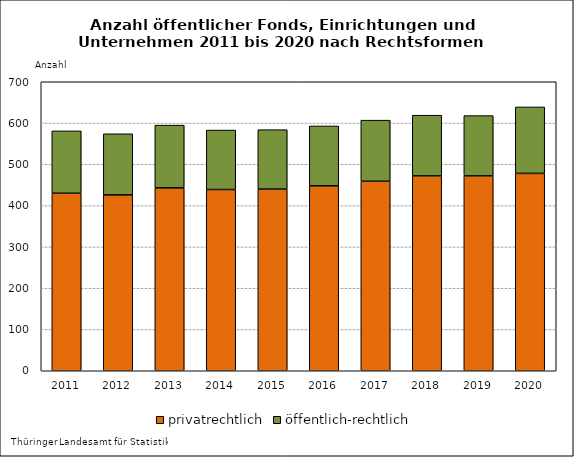
| Category | privatrechtlich | öffentlich-rechtlich |
|---|---|---|
| 2011.0 | 430 | 151 |
| 2012.0 | 426 | 148 |
| 2013.0 | 443 | 152 |
| 2014.0 | 439 | 144 |
| 2015.0 | 440 | 144 |
| 2016.0 | 448 | 145 |
| 2017.0 | 459 | 148 |
| 2018.0 | 472 | 147 |
| 2019.0 | 472 | 146 |
| 2020.0 | 478 | 161 |